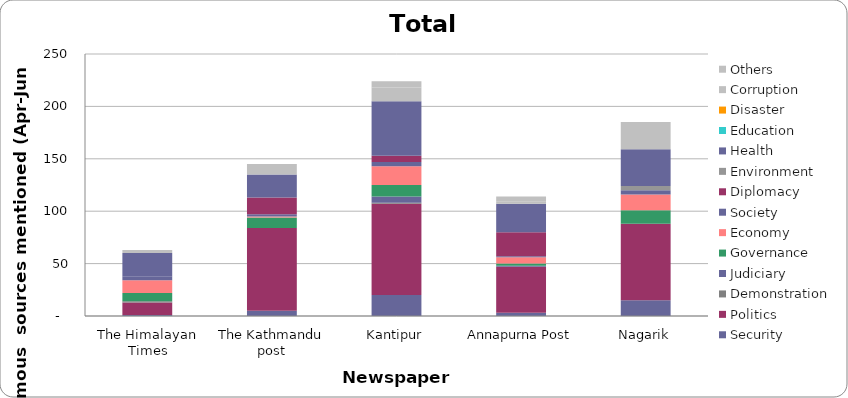
| Category | Security | Politics | Demonstration | Judiciary | Governance | Economy | Society | Diplomacy | Environment | Health | Education | Disaster | Corruption | Others |
|---|---|---|---|---|---|---|---|---|---|---|---|---|---|---|
| The Himalayan Times | 1 | 12 | 1 | 0 | 8 | 12 | 4 | 0 | 0 | 22 | 0 | 0 | 0 | 3 |
| The Kathmandu post | 5 | 79 | 0 | 0 | 10 | 1 | 2 | 16 | 0 | 22 | 0 | 0 | 10 | 0 |
| Kantipur | 20 | 87 | 1 | 6 | 11 | 18 | 4 | 6 | 0 | 52 | 0 | 0 | 13 | 6 |
| Annapurna Post | 3 | 44 | 0 | 1 | 2 | 6 | 1 | 23 | 0 | 27 | 0 | 0 | 2 | 5 |
| Nagarik | 15 | 73 | 0 | 0 | 13 | 15 | 4 | 0 | 4 | 35 | 0 | 0 | 26 | 0 |